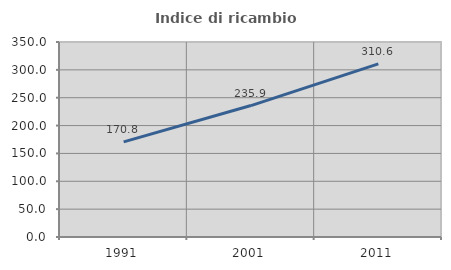
| Category | Indice di ricambio occupazionale  |
|---|---|
| 1991.0 | 170.812 |
| 2001.0 | 235.922 |
| 2011.0 | 310.609 |